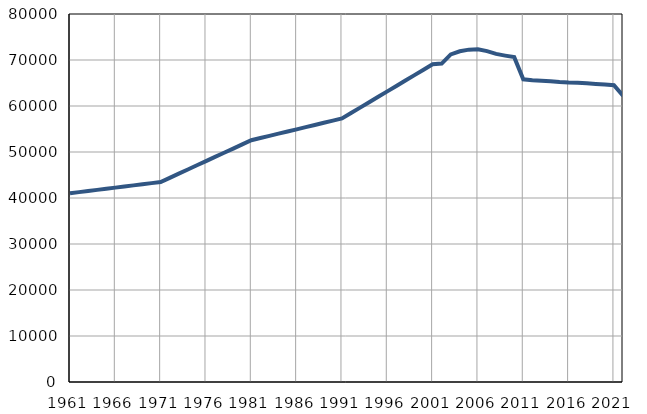
| Category | Број
становника |
|---|---|
| 1961.0 | 41036 |
| 1962.0 | 41280 |
| 1963.0 | 41524 |
| 1964.0 | 41768 |
| 1965.0 | 42012 |
| 1966.0 | 42257 |
| 1967.0 | 42501 |
| 1968.0 | 42745 |
| 1969.0 | 42989 |
| 1970.0 | 43233 |
| 1971.0 | 43477 |
| 1972.0 | 44386 |
| 1973.0 | 45295 |
| 1974.0 | 46204 |
| 1975.0 | 47113 |
| 1976.0 | 48022 |
| 1977.0 | 48930 |
| 1978.0 | 49839 |
| 1979.0 | 50748 |
| 1980.0 | 51657 |
| 1981.0 | 52566 |
| 1982.0 | 53039 |
| 1983.0 | 53511 |
| 1984.0 | 53984 |
| 1985.0 | 54456 |
| 1986.0 | 54929 |
| 1987.0 | 55401 |
| 1988.0 | 55874 |
| 1989.0 | 56346 |
| 1990.0 | 56819 |
| 1991.0 | 57291 |
| 1992.0 | 58468 |
| 1993.0 | 59646 |
| 1994.0 | 60823 |
| 1995.0 | 62000 |
| 1996.0 | 63177 |
| 1997.0 | 64355 |
| 1998.0 | 65532 |
| 1999.0 | 66709 |
| 2000.0 | 67886 |
| 2001.0 | 69064 |
| 2002.0 | 69230 |
| 2003.0 | 71214 |
| 2004.0 | 71900 |
| 2005.0 | 72252 |
| 2006.0 | 72321 |
| 2007.0 | 71931 |
| 2008.0 | 71333 |
| 2009.0 | 70955 |
| 2010.0 | 70621 |
| 2011.0 | 65803 |
| 2012.0 | 65618 |
| 2013.0 | 65513 |
| 2014.0 | 65389 |
| 2015.0 | 65213 |
| 2016.0 | 65088 |
| 2017.0 | 65033 |
| 2018.0 | 64922 |
| 2019.0 | 64794 |
| 2020.0 | 64677 |
| 2021.0 | 64505 |
| 2022.0 | 62215 |